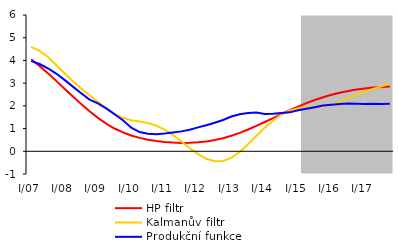
| Category | HP filtr | Kalmanův filtr | Produkční funkce |
|---|---|---|---|
| I/07 | 4.052 | 4.599 | 3.971 |
| II | 3.755 | 4.422 | 3.842 |
| III | 3.436 | 4.149 | 3.655 |
| IV | 3.1 | 3.802 | 3.423 |
| I/08 | 2.756 | 3.433 | 3.145 |
| II | 2.412 | 3.086 | 2.846 |
| III | 2.077 | 2.768 | 2.556 |
| IV | 1.759 | 2.471 | 2.276 |
| I/09 | 1.47 | 2.174 | 2.108 |
| II | 1.216 | 1.891 | 1.889 |
| III | 1.003 | 1.65 | 1.628 |
| IV | 0.83 | 1.475 | 1.367 |
| I/10 | 0.695 | 1.37 | 1.04 |
| II | 0.591 | 1.308 | 0.848 |
| III | 0.511 | 1.242 | 0.773 |
| IV | 0.452 | 1.13 | 0.753 |
| I/11 | 0.41 | 0.953 | 0.78 |
| II | 0.383 | 0.713 | 0.827 |
| III | 0.37 | 0.433 | 0.877 |
| IV | 0.373 | 0.142 | 0.948 |
| I/12 | 0.393 | -0.126 | 1.051 |
| II | 0.433 | -0.329 | 1.149 |
| III | 0.494 | -0.438 | 1.255 |
| IV | 0.578 | -0.427 | 1.38 |
| I/13 | 0.684 | -0.283 | 1.533 |
| II | 0.812 | -0.028 | 1.632 |
| III | 0.959 | 0.305 | 1.69 |
| IV | 1.119 | 0.676 | 1.709 |
| I/14 | 1.289 | 1.038 | 1.643 |
| II | 1.463 | 1.359 | 1.649 |
| III | 1.637 | 1.613 | 1.68 |
| IV | 1.807 | 1.791 | 1.714 |
| I/15 | 1.969 | 1.892 | 1.81 |
| II | 2.12 | 1.93 | 1.873 |
| III | 2.257 | 1.947 | 1.938 |
| IV | 2.38 | 1.979 | 2.017 |
| I/16 | 2.487 | 2.053 | 2.051 |
| II | 2.578 | 2.177 | 2.084 |
| III | 2.655 | 2.328 | 2.101 |
| IV | 2.718 | 2.482 | 2.094 |
| I/17 | 2.768 | 2.624 | 2.086 |
| II | 2.806 | 2.749 | 2.091 |
| III | 2.832 | 2.862 | 2.078 |
| IV | 2.85 | 2.969 | 2.088 |